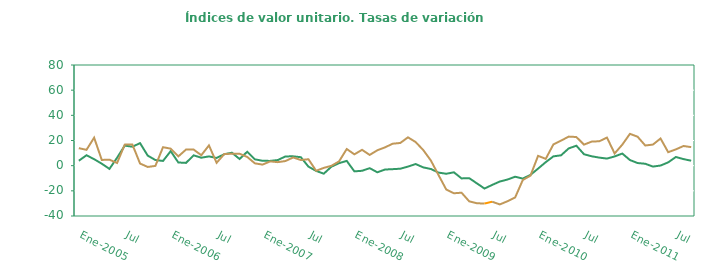
| Category | Series 0 | Series 1 |
|---|---|---|
| Ene-2005 | 3.909 | 13.916 |
|  | 8.279 | 12.58 |
|  | 5.16 | 22.235 |
|  | 1.539 | 4.549 |
|  | -2.563 | 4.765 |
|  | 6.309 | 2.13 |
| Jul | 15.954 | 16.721 |
|  | 15.047 | 16.775 |
|  | 17.903 | 1.701 |
|  | 8.002 | -1.026 |
|  | 4.48 | -0.18 |
|  | 3.751 | 14.681 |
| Ene-2006 | 11.545 | 13.528 |
|  | 2.531 | 7.374 |
|  | 2.196 | 12.761 |
|  | 8.21 | 12.807 |
|  | 6.324 | 8.299 |
|  | 7.366 | 16.107 |
| Jul | 6.136 | 2.278 |
|  | 9.098 | 9.197 |
|  | 10.311 | 9.515 |
|  | 5.291 | 9.478 |
|  | 11.064 | 6.947 |
|  | 5.048 | 1.85 |
| Ene-2007 | 3.86 | 0.839 |
|  | 3.787 | 3.399 |
|  | 4.467 | 2.79 |
|  | 7.361 | 3.688 |
|  | 7.411 | 6.52 |
|  | 6.737 | 4.486 |
| Jul | -0.764 | 5.108 |
|  | -4.153 | -4.07 |
|  | -6.375 | -1.761 |
|  | -0.812 | -0.112 |
|  | 1.997 | 3.406 |
|  | 3.783 | 13.241 |
| Ene-2008 | -4.528 | 9.01 |
|  | -4.075 | 12.584 |
|  | -1.985 | 8.539 |
|  | -5.268 | 12.24 |
|  | -3.067 | 14.548 |
|  | -2.778 | 17.445 |
| Jul | -2.422 | 18.04 |
|  | -0.742 | 22.521 |
|  | 1.31 | 18.788 |
|  | -1.372 | 12.392 |
|  | -2.66 | 4.034 |
|  | -5.51 | -7.553 |
| Ene-2009 | -6.431 | -18.937 |
|  | -5.28 | -21.928 |
|  | -10.129 | -21.486 |
|  | -9.914 | -28.334 |
|  | -14.044 | -29.866 |
|  | -18.175 | -30.107 |
| Jul | -15.303 | -28.657 |
|  | -12.6 | -30.795 |
|  | -11.038 | -28.283 |
|  | -8.793 | -25.29 |
|  | -10.256 | -11.41 |
|  | -7.356 | -7.942 |
| Ene-2010 | -2.34 | 7.805 |
|  | 2.796 | 5.416 |
|  | 7.397 | 16.884 |
|  | 8.226 | 19.892 |
|  | 13.699 | 23.103 |
|  | 15.867 | 22.758 |
| Jul | 9.083 | 16.708 |
|  | 7.449 | 19.131 |
|  | 6.401 | 19.396 |
|  | 5.635 | 22.322 |
|  | 7.328 | 9.687 |
|  | 9.633 | 16.699 |
| Ene-2011 | 4.471 | 25.291 |
|  | 2.083 | 23.015 |
|  | 1.523 | 16.031 |
|  | -0.722 | 16.754 |
|  | 0.104 | 21.579 |
|  | 2.638 | 10.701 |
| Jul | 6.894 | 12.943 |